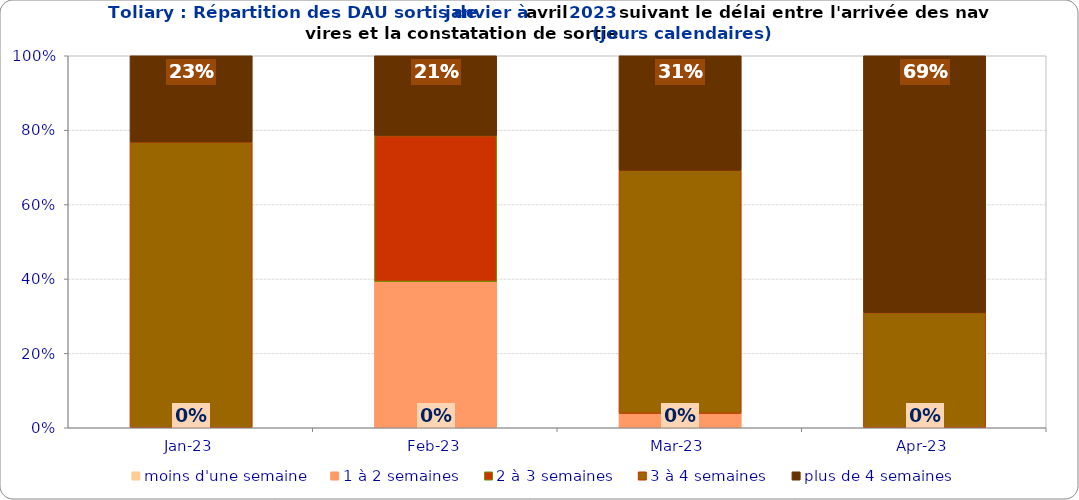
| Category | moins d'une semaine | 1 à 2 semaines | 2 à 3 semaines | 3 à 4 semaines | plus de 4 semaines |
|---|---|---|---|---|---|
| 2023-01-01 | 0 | 0 | 0 | 0.768 | 0.232 |
| 2023-02-01 | 0 | 0.393 | 0.393 | 0 | 0.214 |
| 2023-03-01 | 0 | 0.038 | 0 | 0.654 | 0.308 |
| 2023-04-01 | 0 | 0 | 0 | 0.31 | 0.69 |